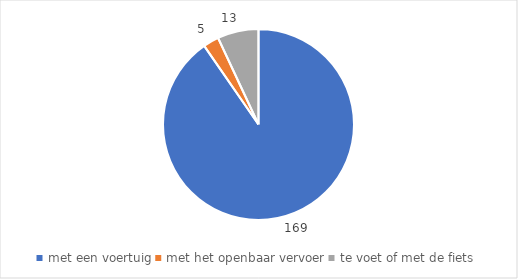
| Category | Series 0 |
|---|---|
| met een voertuig | 169 |
| met het openbaar vervoer | 5 |
| te voet of met de fiets | 13 |